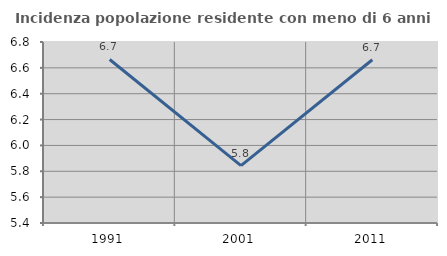
| Category | Incidenza popolazione residente con meno di 6 anni |
|---|---|
| 1991.0 | 6.665 |
| 2001.0 | 5.844 |
| 2011.0 | 6.663 |